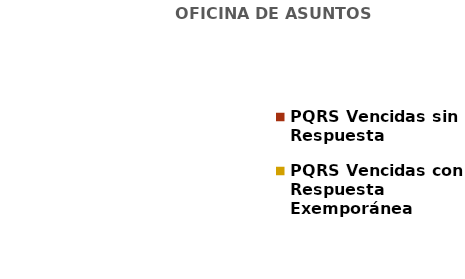
| Category | OFICINA DE ASUNTOS DISCIPLINARIOS |
|---|---|
| PQRS Vencidas sin Respuesta | 0 |
| PQRS Vencidas con Respuesta Exemporánea | 0 |